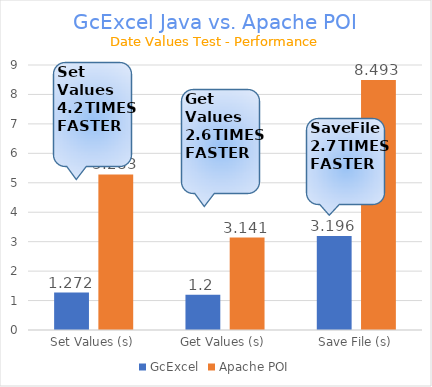
| Category | GcExcel | Apache POI |
|---|---|---|
| Set Values (s) | 1.272 | 5.283 |
| Get Values (s) | 1.2 | 3.141 |
| Save File (s) | 3.196 | 8.493 |